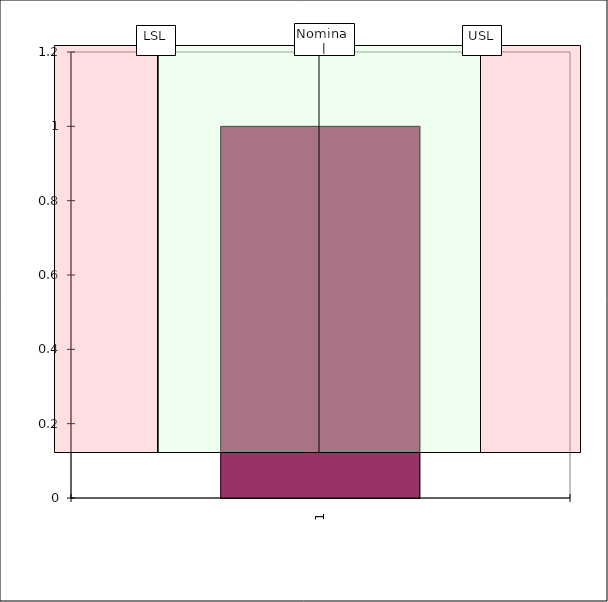
| Category | Series 1 |
|---|---|
| 1.0 | 1 |